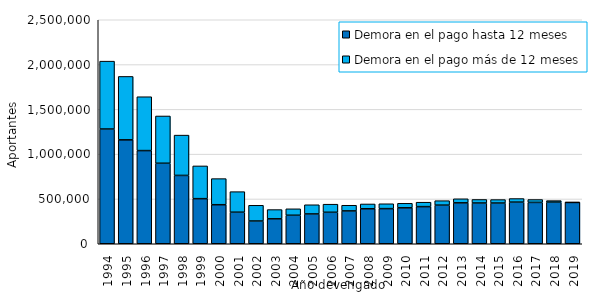
| Category | Demora en el pago hasta 12 meses | Demora en el pago más de 12 meses |
|---|---|---|
| 1994.0 | 1280597 | 757461.167 |
| 1995.0 | 1159708 | 707936.583 |
| 1996.0 | 1039797 | 601095.417 |
| 1997.0 | 898444 | 527560.75 |
| 1998.0 | 762698 | 449861.667 |
| 1999.0 | 503149 | 365630.667 |
| 2000.0 | 435718 | 291302.167 |
| 2001.0 | 352134 | 229352.083 |
| 2002.0 | 253792 | 175570.917 |
| 2003.0 | 278386 | 103140.833 |
| 2004.0 | 318194 | 71824.25 |
| 2005.0 | 332792 | 102436.083 |
| 2006.0 | 351310 | 90245.917 |
| 2007.0 | 366554 | 63189.167 |
| 2008.0 | 390478 | 53656.083 |
| 2009.0 | 391973 | 54388.75 |
| 2010.0 | 401019 | 50482.333 |
| 2011.0 | 414489 | 49340.583 |
| 2012.0 | 430991 | 49739.917 |
| 2013.0 | 456430 | 45301.917 |
| 2014.0 | 454681 | 39597.583 |
| 2015.0 | 454449 | 38638.917 |
| 2016.0 | 464611 | 39946.583 |
| 2017.0 | 461503 | 32064.667 |
| 2018.0 | 464656 | 16818.583 |
| 2019.0 | 461390 | 1288.417 |